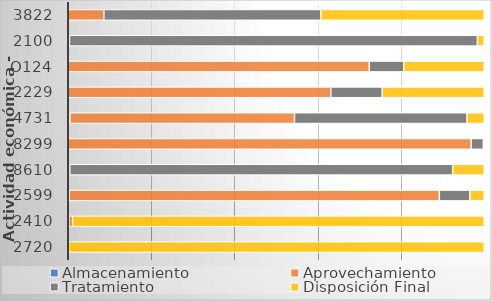
| Category | Almacenamiento | Aprovechamiento | Tratamiento | Disposición Final |
|---|---|---|---|---|
| 2720 | 0 | 3421 | 71.6 | 4635285 |
| 2410 | 4840.6 | 30336.84 | 0 | 3338497.6 |
| 2599 | 2469.45 | 1120667.6 | 92519.1 | 43456.8 |
| 8610 | 18.2 | 4019.2 | 1000286.85 | 82515.02 |
| 8299 | 0 | 881725 | 26730 | 2003 |
| 4731 | 3144.1 | 416955.62 | 320434.15 | 31975.3 |
| 2229 | 0 | 304243.43 | 59528.5 | 118209.2 |
| O124 | 0 | 331922.66 | 38147.4 | 88689.3 |
| 2100 | 0 | 1218 | 423360.18 | 7124.9 |
| 3822 | 0 | 35232 | 215017.2 | 161765.6 |